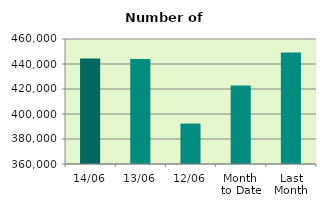
| Category | Series 0 |
|---|---|
| 14/06 | 444342 |
| 13/06 | 444080 |
| 12/06 | 392310 |
| Month 
to Date | 422705.8 |
| Last
Month | 449234.545 |